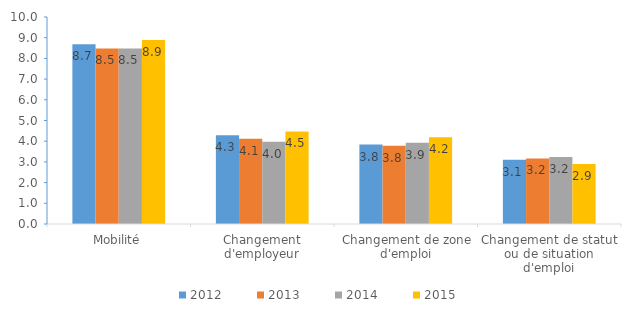
| Category | 2012 | 2013 | 2014 | 2015 |
|---|---|---|---|---|
| Mobilité | 8.678 | 8.478 | 8.482 | 8.888 |
| Changement d'employeur | 4.29 | 4.12 | 3.97 | 4.47 |
| Changement de zone d'emploi | 3.84 | 3.78 | 3.93 | 4.19 |
| Changement de statut ou de situation d'emploi | 3.1 | 3.17 | 3.24 | 2.9 |